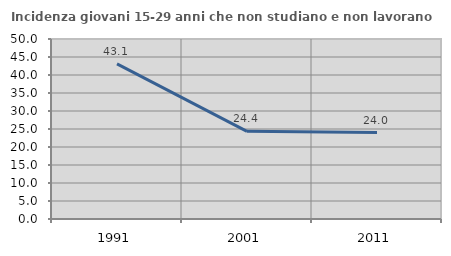
| Category | Incidenza giovani 15-29 anni che non studiano e non lavorano  |
|---|---|
| 1991.0 | 43.103 |
| 2001.0 | 24.352 |
| 2011.0 | 24 |